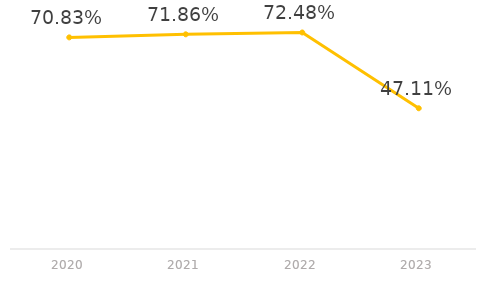
| Category | Series 0 |
|---|---|
| 2020.0 | 0.708 |
| 2021.0 | 0.719 |
| 2022.0 | 0.725 |
| 2023.0 | 0.471 |